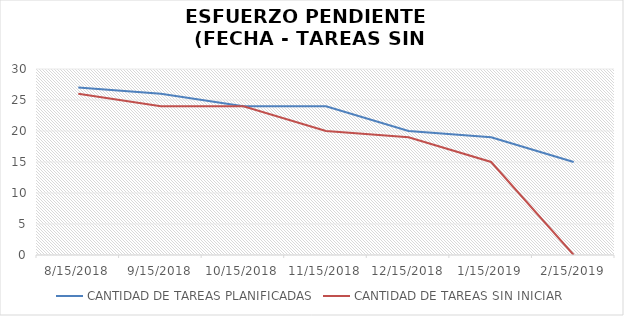
| Category | CANTIDAD DE TAREAS PLANIFICADAS | CANTIDAD DE TAREAS SIN INICIAR |
|---|---|---|
| 8/15/18 | 27 | 26 |
| 9/15/18 | 26 | 24 |
| 10/15/18 | 24 | 24 |
| 11/15/18 | 24 | 20 |
| 12/15/18 | 20 | 19 |
| 1/15/19 | 19 | 15 |
| 2/15/19 | 15 | 0 |